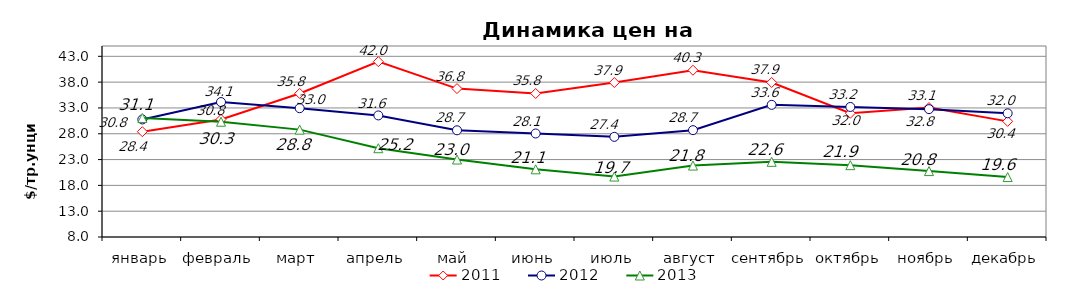
| Category | 2011 | 2012 | 2013 |
|---|---|---|---|
| январь | 28.4 | 30.77 | 31.06 |
| февраль | 30.78 | 34.14 | 30.33 |
| март | 35.81 | 32.95 | 28.8 |
| апрель | 41.97 | 31.55 | 25.2 |
| май | 36.75 | 28.67 | 23.01 |
| июнь | 35.8 | 28.05 | 21.11 |
| июль | 37.92 | 27.4 | 19.71 |
| август | 40.3 | 28.7 | 21.84 |
| сентябрь | 37.93 | 33.6 | 22.56 |
| октябрь | 31.975 | 33.19 | 21.92 |
| ноябрь | 33.08 | 32.77 | 20.77 |
| декабрь | 30.4 | 31.96 | 19.61 |